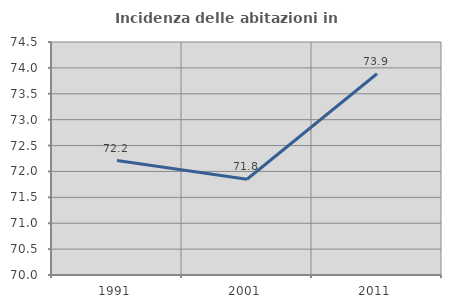
| Category | Incidenza delle abitazioni in proprietà  |
|---|---|
| 1991.0 | 72.21 |
| 2001.0 | 71.849 |
| 2011.0 | 73.887 |